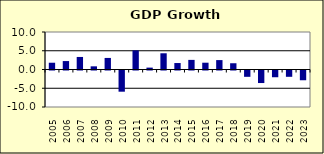
| Category | 0.4 |
|---|---|
| 2005.0 | 1.805 |
| 2006.0 | 2.249 |
| 2007.0 | 3.343 |
| 2008.0 | 0.844 |
| 2009.0 | 3.083 |
| 2010.0 | -5.652 |
| 2011.0 | 5.098 |
| 2012.0 | 0.502 |
| 2013.0 | 4.325 |
| 2014.0 | 1.723 |
| 2015.0 | 2.563 |
| 2016.0 | 1.812 |
| 2017.0 | 2.51 |
| 2018.0 | 1.668 |
| 2019.0 | -1.685 |
| 2020.0 | -3.343 |
| 2021.0 | -1.798 |
| 2022.0 | -1.682 |
| 2023.0 | -2.6 |